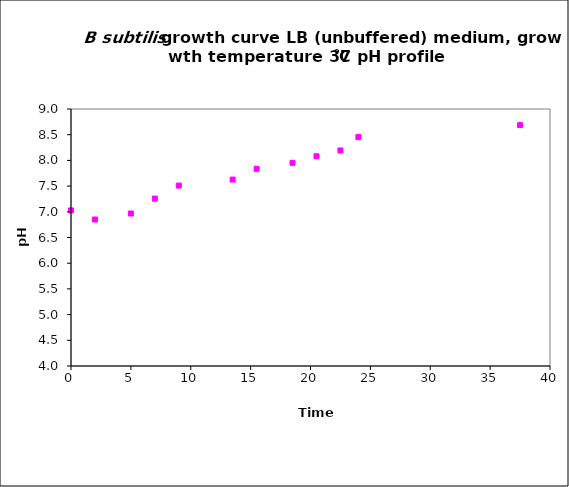
| Category | Series 1 |
|---|---|
| 0.0 | 7.027 |
| 2.0 | 6.85 |
| 5.0 | 6.967 |
| 7.0 | 7.257 |
| 9.0 | 7.51 |
| 13.5 | 7.627 |
| 15.5 | 7.837 |
| 18.5 | 7.953 |
| 20.5 | 8.08 |
| 22.5 | 8.193 |
| 24.0 | 8.453 |
| 37.5 | 8.687 |